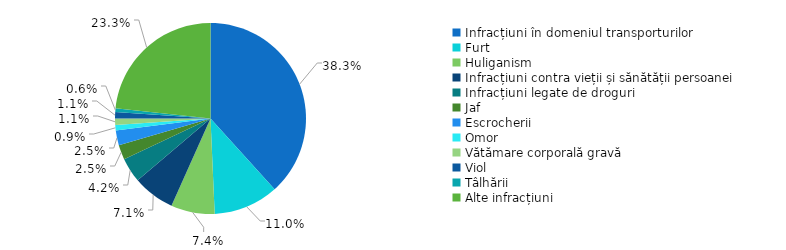
| Category | 2022 |
|---|---|
| Infracțiuni în domeniul transporturilor | 38.3 |
| Furt | 11 |
| Huliganism | 7.4 |
| Infracțiuni contra vieții și sănătății persoanei | 7.1 |
| Infracțiuni legate de droguri | 4.2 |
| Jaf | 2.5 |
| Escrocherii | 2.5 |
| Omor | 0.9 |
| Vătămare corporală gravă | 1.1 |
| Viol | 1.1 |
| Tâlhării | 0.6 |
| Alte infracțiuni | 23.3 |